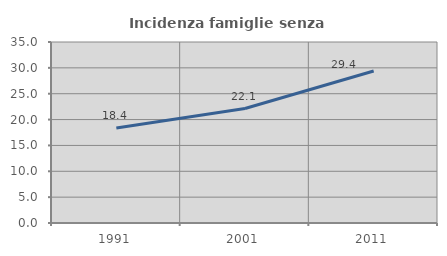
| Category | Incidenza famiglie senza nuclei |
|---|---|
| 1991.0 | 18.384 |
| 2001.0 | 22.134 |
| 2011.0 | 29.391 |